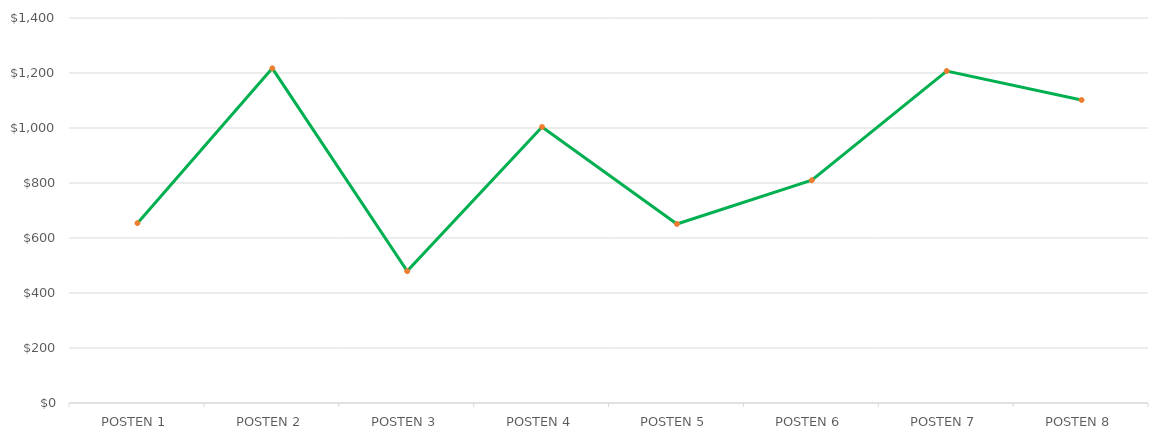
| Category | Series 1 |
|---|---|
| POSTEN 1 | 653.975 |
| POSTEN 2 | 1217.065 |
| POSTEN 3 | 479.5 |
| POSTEN 4 | 1003.75 |
| POSTEN 5 | 651 |
| POSTEN 6 | 810 |
| POSTEN 7 | 1207.25 |
| POSTEN 8 | 1101.76 |